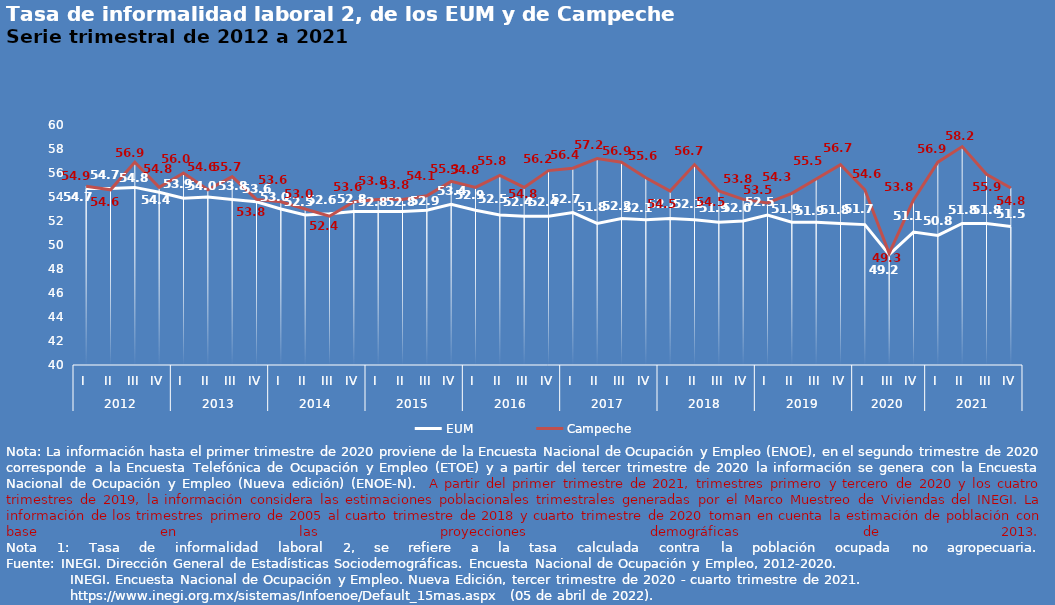
| Category | EUM | Campeche |
|---|---|---|
| 0 | 54.7 | 54.9 |
| 1 | 54.7 | 54.6 |
| 2 | 54.8 | 56.9 |
| 3 | 54.4 | 54.8 |
| 4 | 53.9 | 56 |
| 5 | 54 | 54.6 |
| 6 | 53.8 | 55.7 |
| 7 | 53.6 | 53.8 |
| 8 | 53 | 53.6 |
| 9 | 52.5 | 53 |
| 10 | 52.6 | 52.4 |
| 11 | 52.8 | 53.6 |
| 12 | 52.8 | 53.8 |
| 13 | 52.8 | 53.8 |
| 14 | 52.9 | 54.1 |
| 15 | 53.4 | 55.3 |
| 16 | 52.9 | 54.8 |
| 17 | 52.5 | 55.8 |
| 18 | 52.4 | 54.8 |
| 19 | 52.4 | 56.2 |
| 20 | 52.7 | 56.4 |
| 21 | 51.8 | 57.2 |
| 22 | 52.2 | 56.9 |
| 23 | 52.1 | 55.6 |
| 24 | 52.2 | 54.5 |
| 25 | 52.1 | 56.7 |
| 26 | 51.9 | 54.5 |
| 27 | 52 | 53.8 |
| 28 | 52.5 | 53.5 |
| 29 | 51.9 | 54.3 |
| 30 | 51.9 | 55.5 |
| 31 | 51.8 | 56.7 |
| 32 | 51.7 | 54.6 |
| 33 | 49.2 | 49.3 |
| 34 | 51.073 | 53.759 |
| 35 | 50.8 | 56.9 |
| 36 | 51.8 | 58.2 |
| 37 | 51.8 | 55.9 |
| 38 | 51.533 | 54.75 |